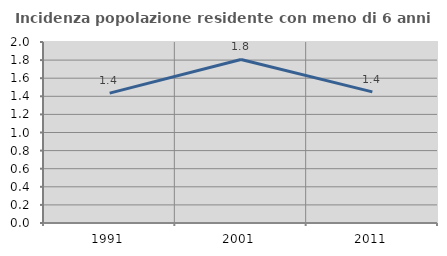
| Category | Incidenza popolazione residente con meno di 6 anni |
|---|---|
| 1991.0 | 1.435 |
| 2001.0 | 1.807 |
| 2011.0 | 1.449 |